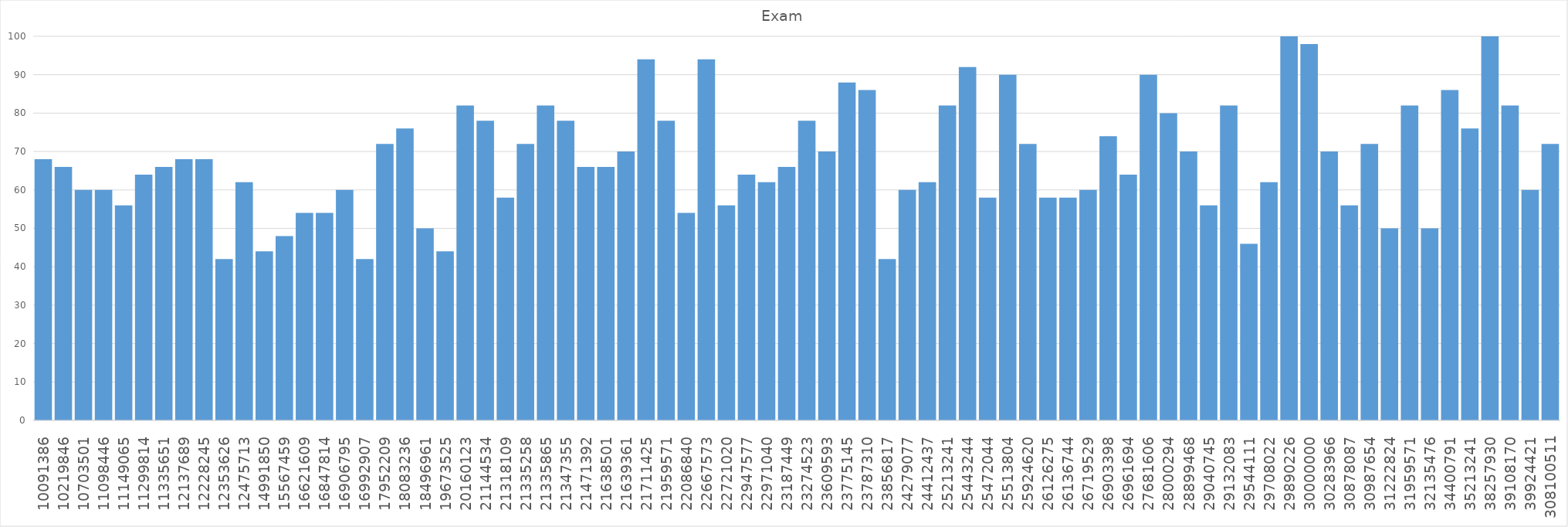
| Category | Exam |
|---|---|
| 10091386.0 | 68 |
| 10219846.0 | 66 |
| 10703501.0 | 60 |
| 11098446.0 | 60 |
| 11149065.0 | 56 |
| 11299814.0 | 64 |
| 11335651.0 | 66 |
| 12137689.0 | 68 |
| 12228245.0 | 68 |
| 12353626.0 | 42 |
| 12475713.0 | 62 |
| 14991850.0 | 44 |
| 15567459.0 | 48 |
| 16621609.0 | 54 |
| 16847814.0 | 54 |
| 16906795.0 | 60 |
| 16992907.0 | 42 |
| 17952209.0 | 72 |
| 18083236.0 | 76 |
| 18496961.0 | 50 |
| 19673525.0 | 44 |
| 20160123.0 | 82 |
| 21144534.0 | 78 |
| 21318109.0 | 58 |
| 21335258.0 | 72 |
| 21335865.0 | 82 |
| 21347355.0 | 78 |
| 21471392.0 | 66 |
| 21638501.0 | 66 |
| 21639361.0 | 70 |
| 21711425.0 | 94 |
| 21959571.0 | 78 |
| 22086840.0 | 54 |
| 22667573.0 | 94 |
| 22721020.0 | 56 |
| 22947577.0 | 64 |
| 22971040.0 | 62 |
| 23187449.0 | 66 |
| 23274523.0 | 78 |
| 23609593.0 | 70 |
| 23775145.0 | 88 |
| 23787310.0 | 86 |
| 23856817.0 | 42 |
| 24279077.0 | 60 |
| 24412437.0 | 62 |
| 25213241.0 | 82 |
| 25443244.0 | 92 |
| 25472044.0 | 58 |
| 25513804.0 | 90 |
| 25924620.0 | 72 |
| 26126275.0 | 58 |
| 26136744.0 | 58 |
| 26719529.0 | 60 |
| 26903398.0 | 74 |
| 26961694.0 | 64 |
| 27681606.0 | 90 |
| 28000294.0 | 80 |
| 28899468.0 | 70 |
| 29040745.0 | 56 |
| 29132083.0 | 82 |
| 29544111.0 | 46 |
| 29708022.0 | 62 |
| 29890226.0 | 100 |
| 30000000.0 | 98 |
| 30283966.0 | 70 |
| 30878087.0 | 56 |
| 30987654.0 | 72 |
| 31222824.0 | 50 |
| 31959571.0 | 82 |
| 32135476.0 | 50 |
| 34400791.0 | 86 |
| 35213241.0 | 76 |
| 38257930.0 | 100 |
| 39108170.0 | 82 |
| 39924421.0 | 60 |
| 308100511.0 | 72 |